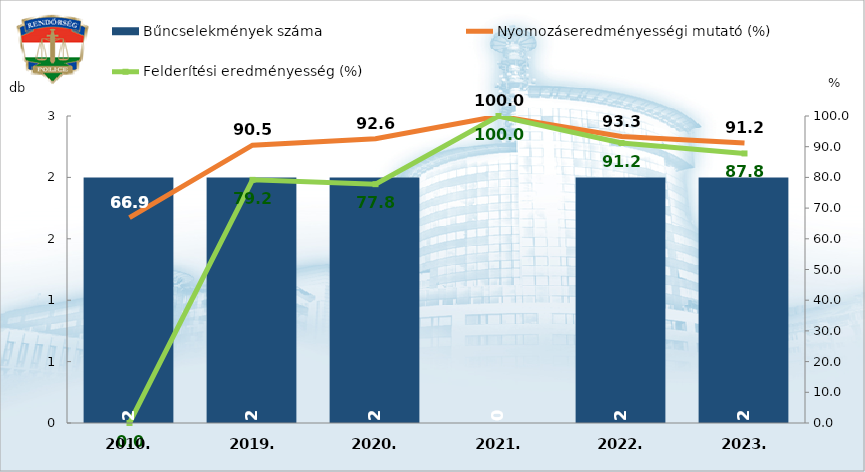
| Category | Bűncselekmények száma |
|---|---|
| 2010. | 2 |
| 2019. | 2 |
| 2020. | 2 |
| 2021. | 0 |
| 2022. | 2 |
| 2023. | 2 |